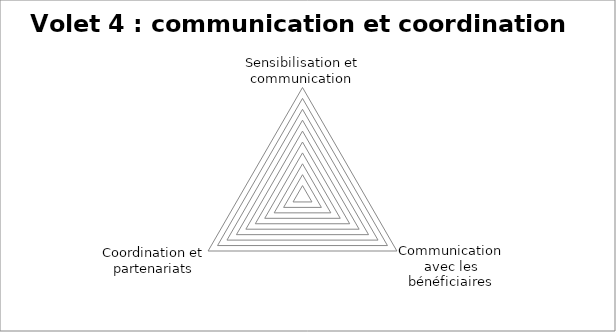
| Category | Series 0 |
|---|---|
| Sensibilisation et communication | 0 |
| Communication avec les bénéficiaires | 0 |
| Coordination et partenariats | 0 |